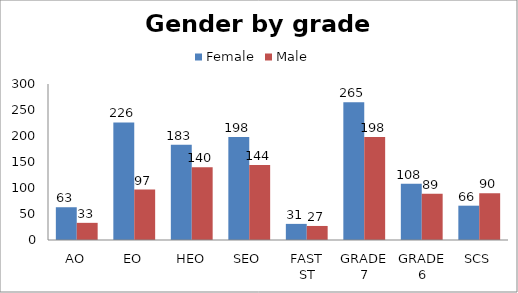
| Category | Female | Male |
|---|---|---|
| AO | 63 | 33 |
| EO | 226 | 97 |
| HEO | 183 | 140 |
| SEO | 198 | 144 |
| FAST ST | 31 | 27 |
| GRADE 7 | 265 | 198 |
| GRADE 6 | 108 | 89 |
| SCS | 66 | 90 |